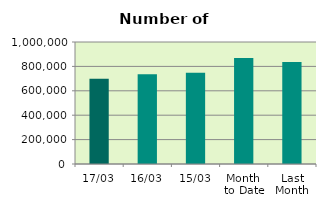
| Category | Series 0 |
|---|---|
| 17/03 | 697760 |
| 16/03 | 735522 |
| 15/03 | 746928 |
| Month 
to Date | 869857.385 |
| Last
Month | 836497.7 |